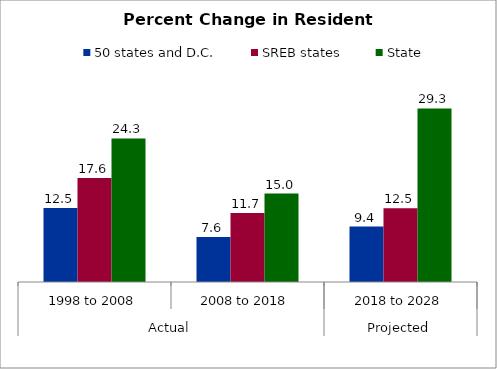
| Category | 50 states and D.C. | SREB states | State |
|---|---|---|---|
| 0 | 12.524 | 17.583 | 24.276 |
| 1 | 7.588 | 11.67 | 14.962 |
| 2 | 9.382 | 12.476 | 29.347 |